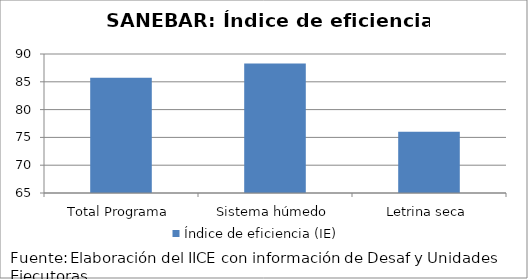
| Category | Índice de eficiencia (IE)  |
|---|---|
| Total Programa | 85.747 |
| Sistema húmedo | 88.308 |
| Letrina seca | 76.031 |